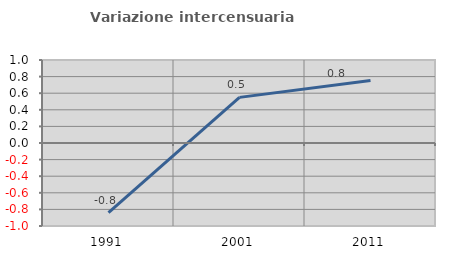
| Category | Variazione intercensuaria annua |
|---|---|
| 1991.0 | -0.839 |
| 2001.0 | 0.55 |
| 2011.0 | 0.754 |